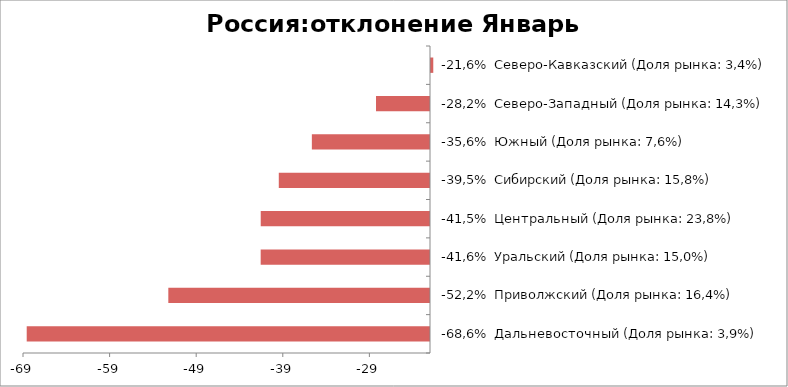
| Category | Россия:отклонение Январь 2016-2015 |
|---|---|
| -68,6%  Дальневосточный (Доля рынка: 3,9%) | -68.571 |
| -52,2%  Приволжский (Доля рынка: 16,4%) | -52.218 |
| -41,6%  Уральский (Доля рынка: 15,0%) | -41.553 |
| -41,5%  Центральный (Доля рынка: 23,8%) | -41.547 |
| -39,5%  Сибирский (Доля рынка: 15,8%) | -39.462 |
| -35,6%  Южный (Доля рынка: 7,6%) | -35.644 |
| -28,2%  Северо-Западный (Доля рынка: 14,3%) | -28.235 |
| -21,6%  Северо-Кавказский (Доля рынка: 3,4%) | -21.622 |